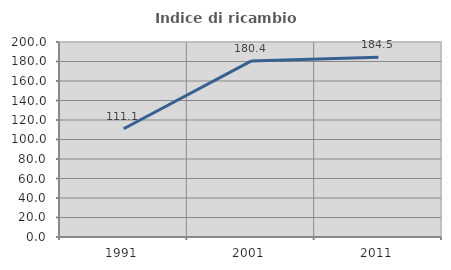
| Category | Indice di ricambio occupazionale  |
|---|---|
| 1991.0 | 111.065 |
| 2001.0 | 180.444 |
| 2011.0 | 184.451 |